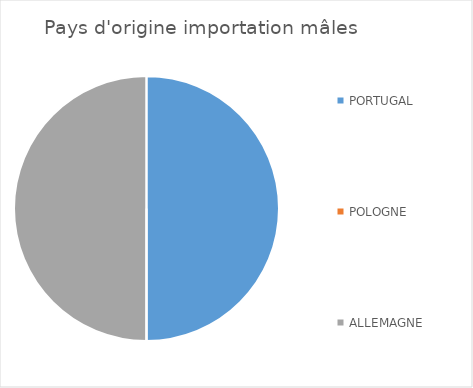
| Category | Series 0 |
|---|---|
| PORTUGAL | 1 |
| POLOGNE | 0 |
| ALLEMAGNE | 1 |